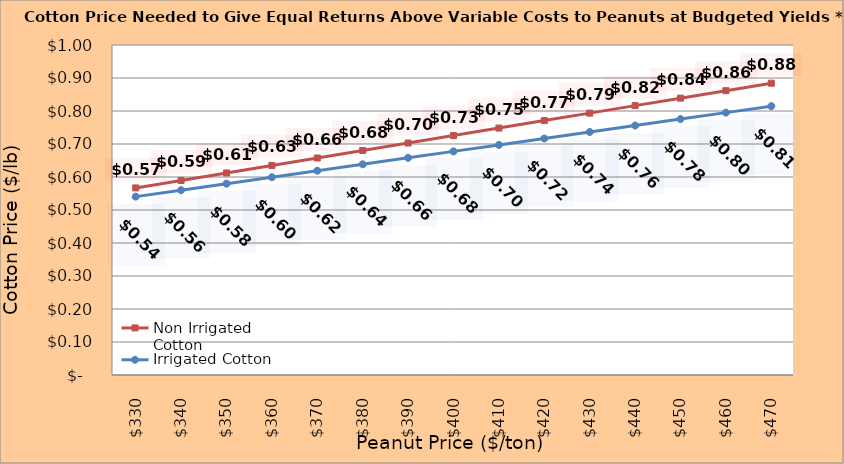
| Category | Non Irrigated Cotton | Irrigated Cotton |
|---|---|---|
| 330.0 | 0.567 | 0.541 |
| 340.0 | 0.59 | 0.56 |
| 350.0 | 0.612 | 0.58 |
| 360.0 | 0.635 | 0.599 |
| 370.0 | 0.658 | 0.619 |
| 380.0 | 0.68 | 0.638 |
| 390.0 | 0.703 | 0.658 |
| 400.0 | 0.726 | 0.678 |
| 410.0 | 0.748 | 0.697 |
| 420.0 | 0.771 | 0.717 |
| 430.0 | 0.794 | 0.736 |
| 440.0 | 0.816 | 0.756 |
| 450.0 | 0.839 | 0.776 |
| 460.0 | 0.862 | 0.795 |
| 470.0 | 0.884 | 0.815 |